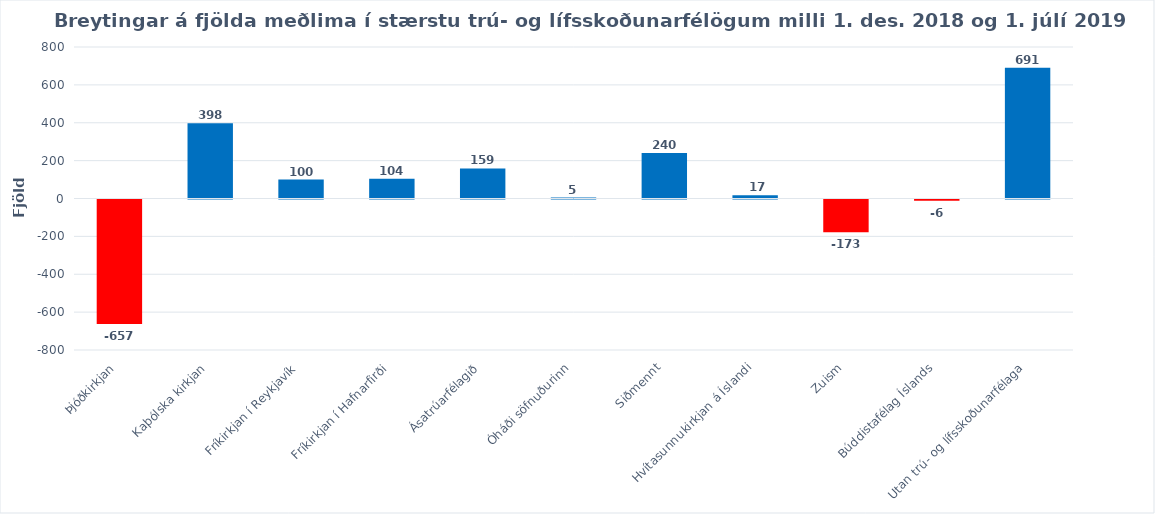
| Category | Series 0 |
|---|---|
| Þjóðkirkjan | -657 |
| Kaþólska kirkjan | 398 |
| Fríkirkjan í Reykjavík | 100 |
| Fríkirkjan í Hafnarfirði | 104 |
| Ásatrúarfélagið | 159 |
| Óháði söfnuðurinn | 5 |
| Siðmennt | 240 |
| Hvítasunnukirkjan á Íslandi | 17 |
| Zuism | -173 |
| Búddistafélag Íslands | -6 |
| Utan trú- og lífsskoðunarfélaga | 691 |